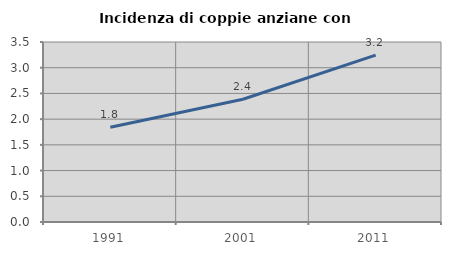
| Category | Incidenza di coppie anziane con figli |
|---|---|
| 1991.0 | 1.843 |
| 2001.0 | 2.386 |
| 2011.0 | 3.246 |